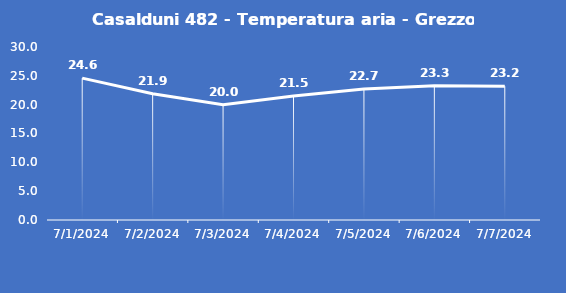
| Category | Casalduni 482 - Temperatura aria - Grezzo (°C) |
|---|---|
| 7/1/24 | 24.6 |
| 7/2/24 | 21.9 |
| 7/3/24 | 20 |
| 7/4/24 | 21.5 |
| 7/5/24 | 22.7 |
| 7/6/24 | 23.3 |
| 7/7/24 | 23.2 |